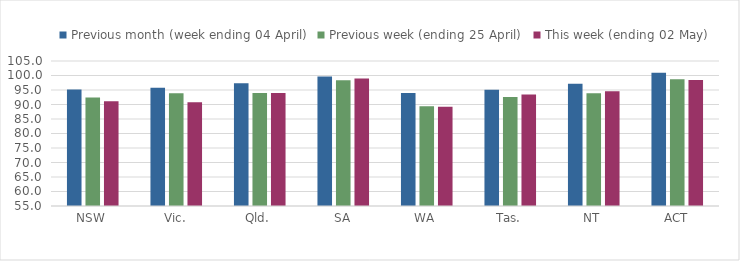
| Category | Previous month (week ending 04 April) | Previous week (ending 25 April) | This week (ending 02 May) |
|---|---|---|---|
| NSW | 95.167 | 92.384 | 91.141 |
| Vic. | 95.765 | 93.865 | 90.764 |
| Qld. | 97.358 | 93.986 | 94.006 |
| SA | 99.648 | 98.34 | 98.999 |
| WA | 93.992 | 89.356 | 89.207 |
| Tas. | 95.083 | 92.57 | 93.416 |
| NT | 97.166 | 93.853 | 94.573 |
| ACT | 100.942 | 98.679 | 98.411 |